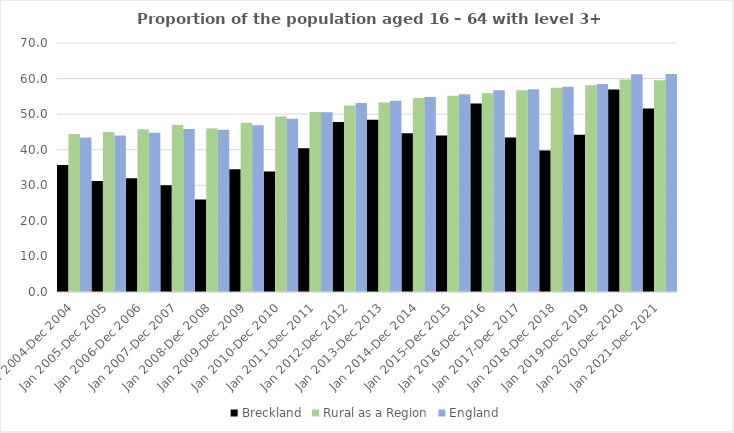
| Category | Breckland | Rural as a Region | England |
|---|---|---|---|
| Jan 2004-Dec 2004 | 35.7 | 44.405 | 43.4 |
| Jan 2005-Dec 2005 | 31.2 | 44.973 | 44 |
| Jan 2006-Dec 2006 | 32 | 45.774 | 44.8 |
| Jan 2007-Dec 2007 | 30 | 46.968 | 45.8 |
| Jan 2008-Dec 2008 | 26 | 45.964 | 45.6 |
| Jan 2009-Dec 2009 | 34.5 | 47.59 | 46.9 |
| Jan 2010-Dec 2010 | 33.9 | 49.362 | 48.7 |
| Jan 2011-Dec 2011 | 40.4 | 50.602 | 50.5 |
| Jan 2012-Dec 2012 | 47.8 | 52.439 | 53.1 |
| Jan 2013-Dec 2013 | 48.4 | 53.276 | 53.8 |
| Jan 2014-Dec 2014 | 44.6 | 54.57 | 54.8 |
| Jan 2015-Dec 2015 | 44 | 55.16 | 55.6 |
| Jan 2016-Dec 2016 | 53 | 55.941 | 56.7 |
| Jan 2017-Dec 2017 | 43.4 | 56.689 | 57 |
| Jan 2018-Dec 2018 | 39.8 | 57.389 | 57.7 |
| Jan 2019-Dec 2019 | 44.2 | 58.147 | 58.5 |
| Jan 2020-Dec 2020 | 56.9 | 59.771 | 61.2 |
| Jan 2021-Dec 2021 | 51.6 | 59.54 | 61.3 |